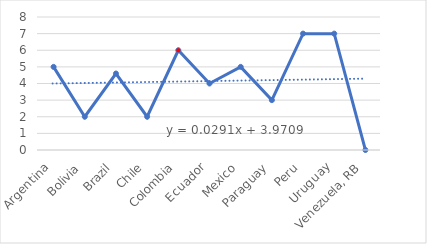
| Category | Series 0 |
|---|---|
| Argentina | 5 |
| Bolivia | 2 |
| Brazil | 4.6 |
| Chile | 2 |
| Colombia | 6 |
| Ecuador | 4 |
| Mexico | 5 |
| Paraguay | 3 |
| Peru | 7 |
| Uruguay | 7 |
| Venezuela, RB | 0 |